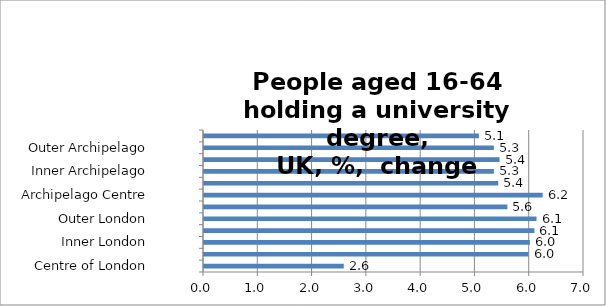
| Category | Series 0 |
|---|---|
| Centre of London | 2.575 |
| London Core | 5.979 |
| Inner London | 6.003 |
| London Suburbs | 6.087 |
| Outer London | 6.126 |
| London Edge | 5.589 |
| Archipelago Centre | 6.239 |
| Archipelago Core | 5.42 |
| Inner Archipelago | 5.34 |
| Archipelago Suburbs | 5.445 |
| Outer Archipelago | 5.34 |
| Archipelago Edge | 5.064 |